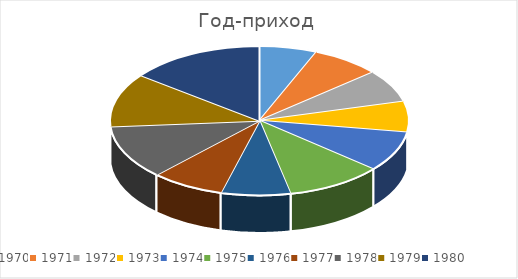
| Category | Доход |
|---|---|
| 1970.0 | 15000 |
| 1971.0 | 18000 |
| 1972.0 | 17000 |
| 1973.0 | 16000 |
| 1974.0 | 21000 |
| 1975.0 | 25000 |
| 1976.0 | 18000 |
| 1977.0 | 19000 |
| 1978.0 | 28000 |
| 1979.0 | 28000 |
| 1980.0 | 35000 |